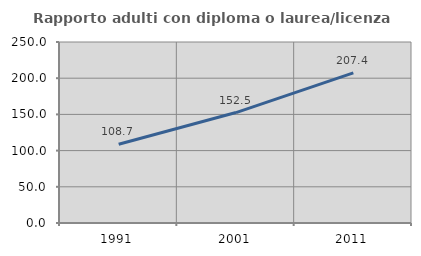
| Category | Rapporto adulti con diploma o laurea/licenza media  |
|---|---|
| 1991.0 | 108.743 |
| 2001.0 | 152.535 |
| 2011.0 | 207.377 |